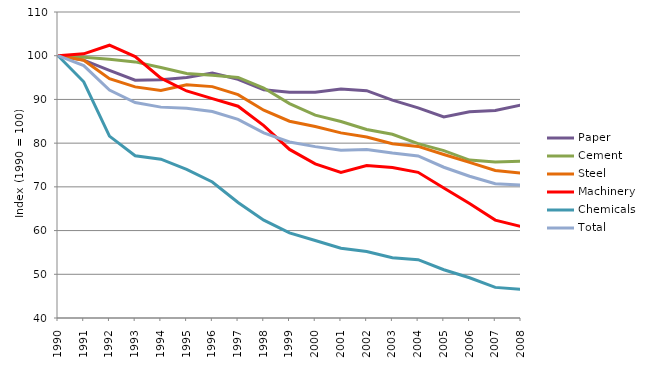
| Category | Paper | Cement | Steel | Machinery | Chemicals | Total |
|---|---|---|---|---|---|---|
| 1990.0 | 100 | 100 | 100 | 100 | 100 | 100 |
| 1991.0 | 98.994 | 99.662 | 98.961 | 100.428 | 94.04 | 97.748 |
| 1992.0 | 96.644 | 99.2 | 94.75 | 102.403 | 81.607 | 92.155 |
| 1993.0 | 94.383 | 98.588 | 92.869 | 99.803 | 77.124 | 89.276 |
| 1994.0 | 94.502 | 97.325 | 92.045 | 94.857 | 76.324 | 88.239 |
| 1995.0 | 95.041 | 95.945 | 93.37 | 91.935 | 74.018 | 87.976 |
| 1996.0 | 96.023 | 95.547 | 92.93 | 90.182 | 71.119 | 87.247 |
| 1997.0 | 94.618 | 95.039 | 91.09 | 88.448 | 66.415 | 85.437 |
| 1998.0 | 92.193 | 92.617 | 87.54 | 84.025 | 62.386 | 82.343 |
| 1999.0 | 91.643 | 89.05 | 85.021 | 78.561 | 59.454 | 80.256 |
| 2000.0 | 91.627 | 86.397 | 83.793 | 75.266 | 57.723 | 79.205 |
| 2001.0 | 92.383 | 84.959 | 82.353 | 73.312 | 55.959 | 78.391 |
| 2002.0 | 91.998 | 83.109 | 81.387 | 74.871 | 55.198 | 78.569 |
| 2003.0 | 89.855 | 82.019 | 79.85 | 74.422 | 53.792 | 77.737 |
| 2004.0 | 88.078 | 79.879 | 79.245 | 73.324 | 53.341 | 77.061 |
| 2005.0 | 85.977 | 78.289 | 77.396 | 69.733 | 51.034 | 74.489 |
| 2006.0 | 87.16 | 76.126 | 75.602 | 66.196 | 49.213 | 72.428 |
| 2007.0 | 87.487 | 75.678 | 73.765 | 62.391 | 47.002 | 70.699 |
| 2008.0 | 88.709 | 75.88 | 73.169 | 60.932 | 46.534 | 70.434 |